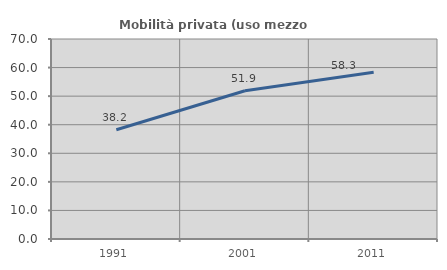
| Category | Mobilità privata (uso mezzo privato) |
|---|---|
| 1991.0 | 38.238 |
| 2001.0 | 51.869 |
| 2011.0 | 58.333 |